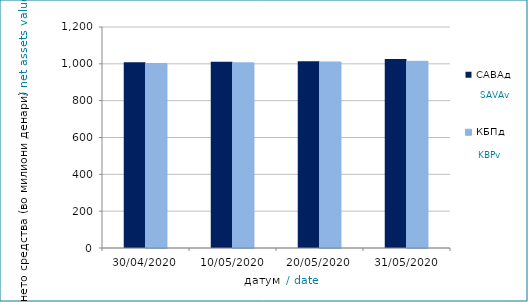
| Category | САВАд | КБПд |
|---|---|---|
| 30/04/2020 | 1009.216 | 1001.945 |
| 10/05/2020 | 1011.168 | 1005.286 |
| 20/05/2020 | 1014.122 | 1009.978 |
| 31/05/2020 | 1025.692 | 1013.801 |